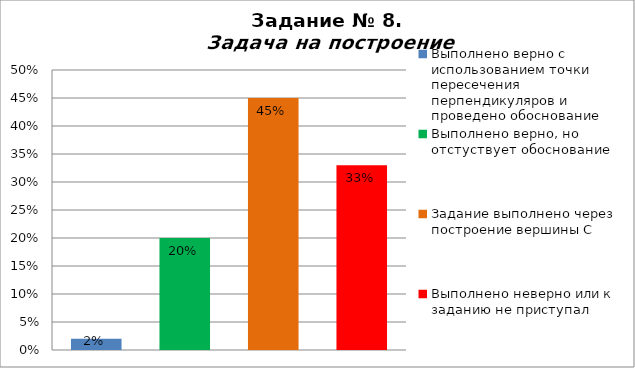
| Category | Задача на построение |
|---|---|
| Выполнено верно с использованием точки пересечения перпендикуляров и проведено обоснование | 0.02 |
| Выполнено верно, но отстуствует обоснование | 0.2 |
| Задание выполнено через построение вершины С | 0.45 |
| Выполнено неверно или к заданию не приступал | 0.33 |